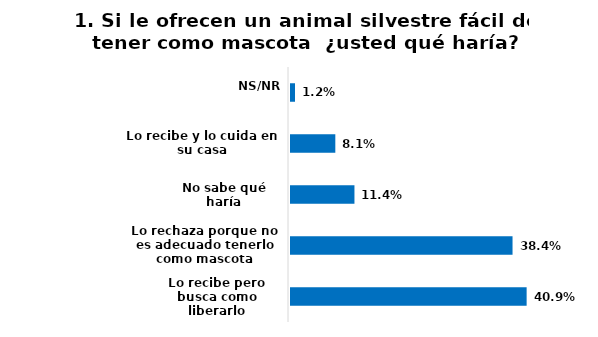
| Category | Series 0 |
|---|---|
| Lo recibe pero busca como liberarlo | 0.409 |
| Lo rechaza porque no es adecuado tenerlo como mascota | 0.384 |
| No sabe qué haría | 0.114 |
| Lo recibe y lo cuida en su casa | 0.081 |
| NS/NR | 0.012 |